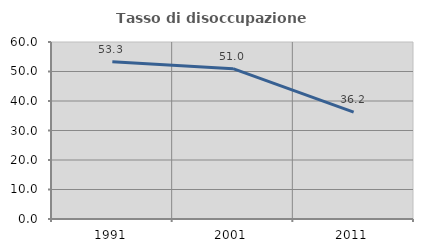
| Category | Tasso di disoccupazione giovanile  |
|---|---|
| 1991.0 | 53.338 |
| 2001.0 | 50.966 |
| 2011.0 | 36.203 |